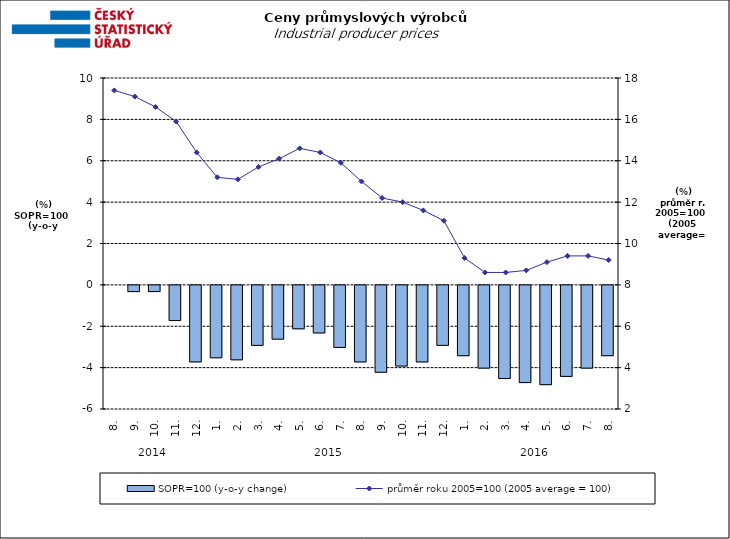
| Category | SOPR=100 (y-o-y change)   |
|---|---|
| 0 | 0 |
| 1 | -0.3 |
| 2 | -0.3 |
| 3 | -1.7 |
| 4 | -3.7 |
| 5 | -3.5 |
| 6 | -3.6 |
| 7 | -2.9 |
| 8 | -2.6 |
| 9 | -2.1 |
| 10 | -2.3 |
| 11 | -3 |
| 12 | -3.7 |
| 13 | -4.2 |
| 14 | -3.9 |
| 15 | -3.7 |
| 16 | -2.9 |
| 17 | -3.4 |
| 18 | -4 |
| 19 | -4.5 |
| 20 | -4.7 |
| 21 | -4.8 |
| 22 | -4.4 |
| 23 | -4 |
| 24 | -3.4 |